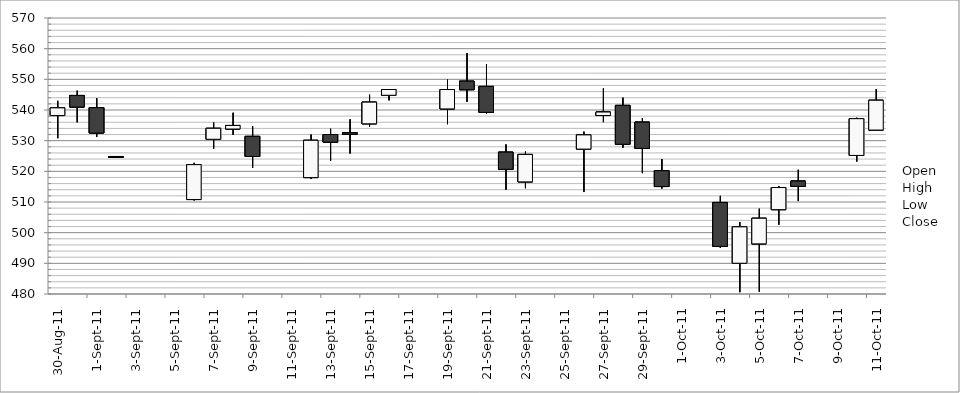
| Category | Open | High | Low | Close |
|---|---|---|---|---|
| 2011-10-11 | 533.46 | 546.8 | 533.46 | 543.18 |
| 2011-10-10 | 525.18 | 537.47 | 523.2 | 537.17 |
| 2011-10-07 | 516.83 | 520.5 | 510.3 | 515.12 |
| 2011-10-06 | 507.5 | 515.23 | 502.6 | 514.71 |
| 2011-10-05 | 496.35 | 507.8 | 480.77 | 504.7 |
| 2011-10-04 | 490.03 | 503.44 | 480.6 | 501.9 |
| 2011-10-03 | 509.85 | 512 | 495 | 495.52 |
| 2011-09-30 | 520.21 | 524 | 514.38 | 515.04 |
| 2011-09-29 | 536.04 | 537.3 | 519.41 | 527.5 |
| 2011-09-28 | 541.5 | 544.02 | 527.7 | 528.84 |
| 2011-09-27 | 538.2 | 547.05 | 536.05 | 539.34 |
| 2011-09-26 | 527.25 | 532.93 | 513.25 | 531.89 |
| 2011-09-23 | 516.56 | 526.42 | 514.5 | 525.51 |
| 2011-09-22 | 526.25 | 528.78 | 514 | 520.66 |
| 2011-09-21 | 547.69 | 555 | 538.86 | 539.2 |
| 2011-09-20 | 549.4 | 558.52 | 542.67 | 546.62 |
| 2011-09-19 | 540.35 | 549.9 | 535.38 | 546.67 |
| 2011-09-16 | 544.8 | 546.84 | 543.14 | 546.68 |
| 2011-09-15 | 535.5 | 544.98 | 534.56 | 542.56 |
| 2011-09-14 | 532.59 | 536.95 | 525.82 | 532.07 |
| 2011-09-13 | 532 | 533.88 | 523.4 | 529.52 |
| 2011-09-12 | 517.96 | 531.99 | 517.5 | 530.12 |
| 2011-09-09 | 531.4 | 534.65 | 521.19 | 524.85 |
| 2011-09-08 | 533.8 | 539.1 | 531.9 | 534.96 |
| 2011-09-07 | 530.45 | 535.94 | 527.4 | 534.03 |
| 2011-09-06 | 510.8 | 522.76 | 510.5 | 522.18 |
| 2011-09-02 | 524.84 | 524.84 | 524.84 | 524.84 |
| 2011-09-01 | 540.75 | 543.83 | 531.22 | 532.5 |
| 2011-08-31 | 544.74 | 546.3 | 536 | 540.96 |
| 2011-08-30 | 538.19 | 542.99 | 530.81 | 540.7 |